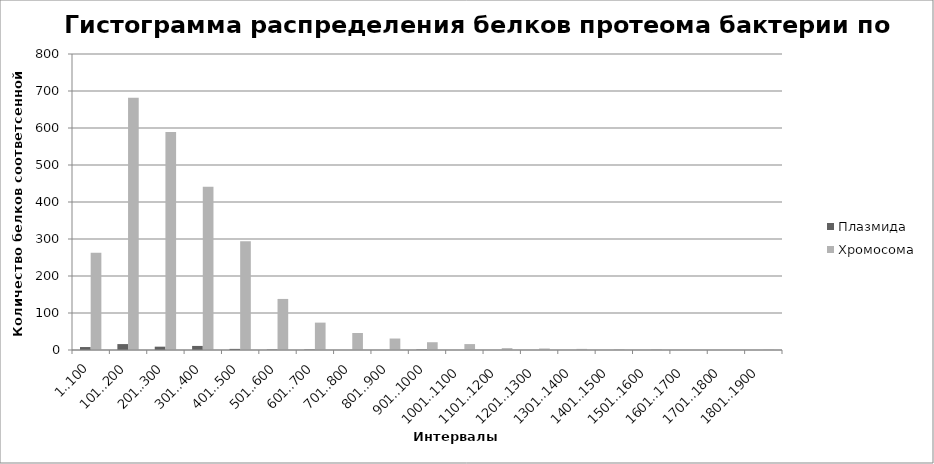
| Category | Плазмида | Хромосома |
|---|---|---|
| 1..100 | 8 | 263 |
| 101..200 | 16 | 682 |
| 201..300 | 9 | 589 |
| 301..400 | 11 | 441 |
| 401..500 | 3 | 294 |
| 501..600 | 1 | 138 |
| 601..700 | 1 | 74 |
| 701..800 | 0 | 46 |
| 801..900 | 0 | 31 |
| 901..1000 | 1 | 21 |
| 1001..1100 | 0 | 16 |
| 1101..1200 | 0 | 5 |
| 1201..1300 | 0 | 4 |
| 1301..1400 | 0 | 3 |
| 1401..1500 | 0 | 2 |
| 1501..1600 | 0 | 2 |
| 1601..1700 | 0 | 0 |
| 1701..1800 | 0 | 0 |
| 1801..1900 | 0 | 1 |